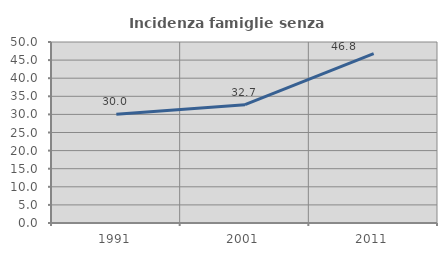
| Category | Incidenza famiglie senza nuclei |
|---|---|
| 1991.0 | 30.033 |
| 2001.0 | 32.675 |
| 2011.0 | 46.794 |